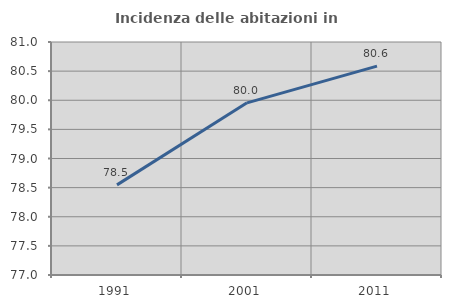
| Category | Incidenza delle abitazioni in proprietà  |
|---|---|
| 1991.0 | 78.547 |
| 2001.0 | 79.956 |
| 2011.0 | 80.586 |